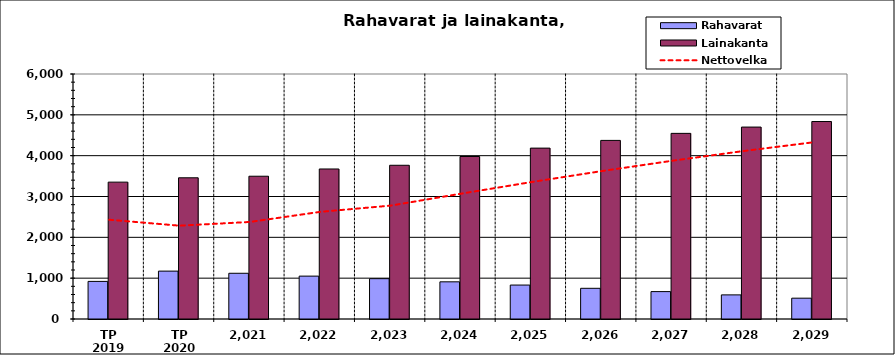
| Category | Rahavarat | Lainakanta |
|---|---|---|
| TP 2019 | 920.936 | 3351.896 |
| TP 2020 | 1172.771 | 3458.312 |
| 2 021 | 1119.753 | 3496.473 |
| 2 022 | 1050.027 | 3674.105 |
| 2 023 | 987.686 | 3764.568 |
| 2 024 | 910.435 | 3979.439 |
| 2 025 | 831.439 | 4184.794 |
| 2 026 | 751.574 | 4373.926 |
| 2 027 | 671.148 | 4546.068 |
| 2 028 | 590.484 | 4700.461 |
| 2 029 | 509.906 | 4836.192 |